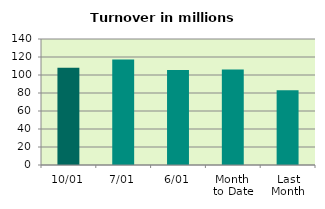
| Category | Series 0 |
|---|---|
| 10/01 | 108.032 |
| 7/01 | 117.093 |
| 6/01 | 105.428 |
| Month 
to Date | 105.992 |
| Last
Month | 83.19 |